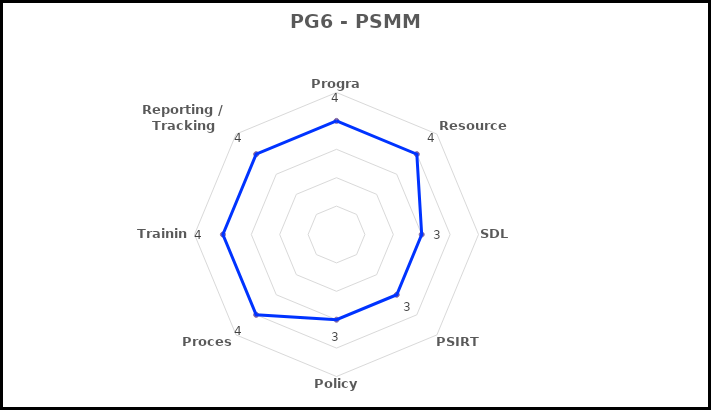
| Category | Series 3 |
|---|---|
| Program | 4 |
| Resources | 4 |
| SDL | 3 |
| PSIRT | 3 |
| Policy | 3 |
| Process | 4 |
| Training | 4 |
| Reporting / Tracking Tools | 4 |